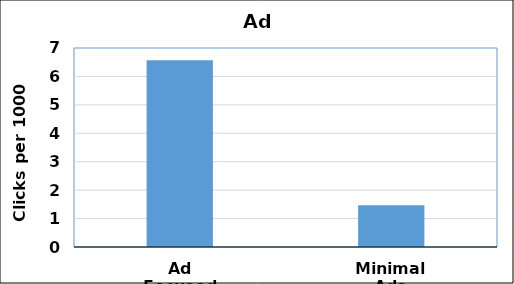
| Category | Series 0 |
|---|---|
| Ad Focused | 6.571 |
| Minimal Ads | 1.47 |